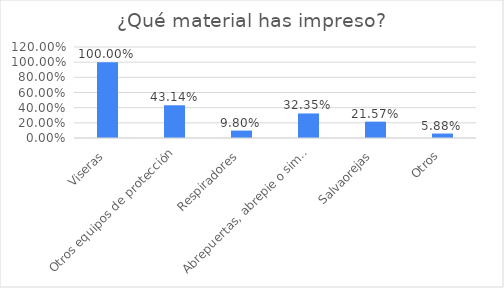
| Category | Series 0 |
|---|---|
| Viseras | 1 |
| Otros equipos de protección | 0.431 |
| Respiradores | 0.098 |
| Abrepuertas, abrepie o similar | 0.324 |
| Salvaorejas | 0.216 |
| Otros | 0.059 |